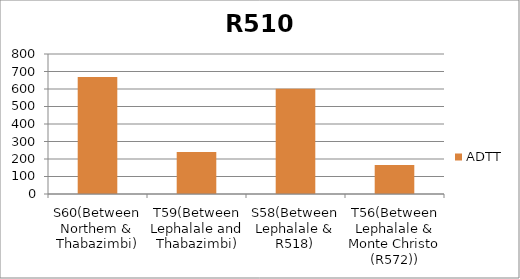
| Category | ADTT |
|---|---|
| S60(Between Northem & Thabazimbi) | 667.951 |
| T59(Between Lephalale and Thabazimbi) | 240.503 |
| S58(Between Lephalale & R518) | 600.763 |
| T56(Between Lephalale & Monte Christo (R572)) | 165.326 |